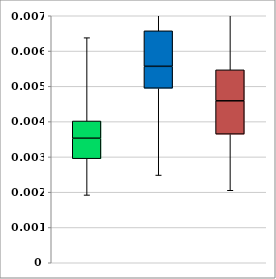
| Category | Series 0 | Series 1 | Series 2 | Series 3 |
|---|---|---|---|---|
| 0 | 0.002 | 0.001 | 0.001 | 0 |
| 1 | 0.002 | 0.002 | 0.001 | 0.001 |
| 2 | 0.002 | 0.002 | 0.001 | 0.001 |